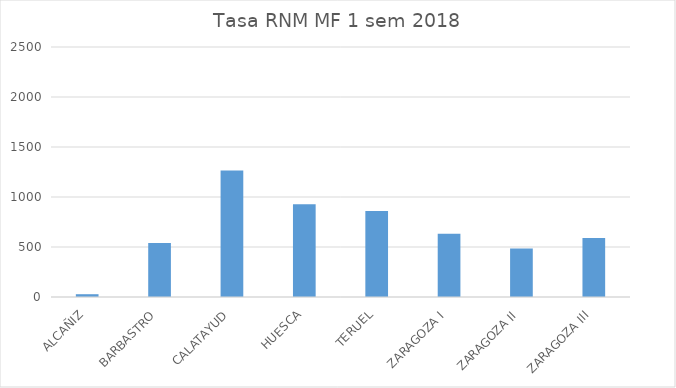
| Category | 1sem 2018 |
|---|---|
| ALCAÑIZ | 27.845 |
| BARBASTRO | 538.752 |
| CALATAYUD | 1264.783 |
| HUESCA | 927.804 |
| TERUEL | 859.808 |
| ZARAGOZA I | 631.918 |
| ZARAGOZA II | 485.478 |
| ZARAGOZA III | 590.875 |